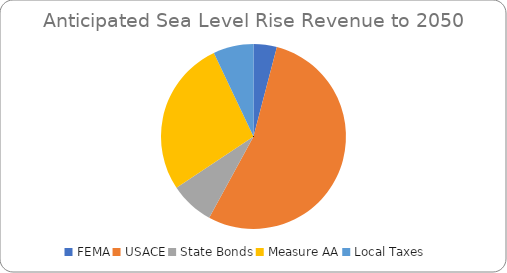
| Category | Series 0 |
|---|---|
| FEMA | 0.041 |
| USACE | 0.539 |
| State Bonds | 0.077 |
| Measure AA | 0.273 |
| Local Taxes | 0.07 |